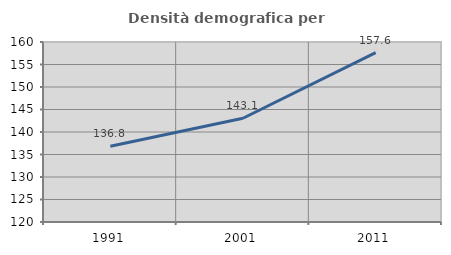
| Category | Densità demografica |
|---|---|
| 1991.0 | 136.817 |
| 2001.0 | 143.059 |
| 2011.0 | 157.623 |